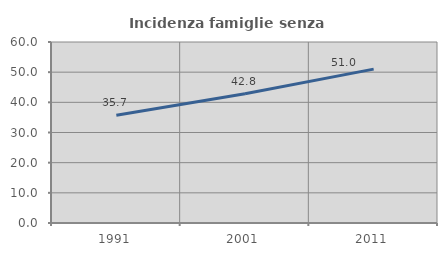
| Category | Incidenza famiglie senza nuclei |
|---|---|
| 1991.0 | 35.714 |
| 2001.0 | 42.814 |
| 2011.0 | 51.009 |